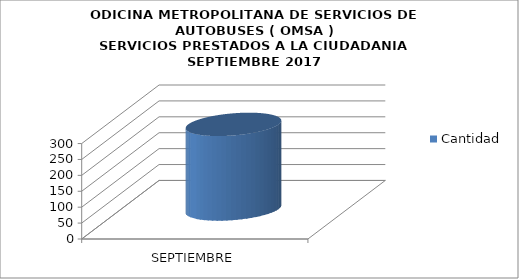
| Category | Cantidad |
|---|---|
| SEPTIEMBRE | 266 |